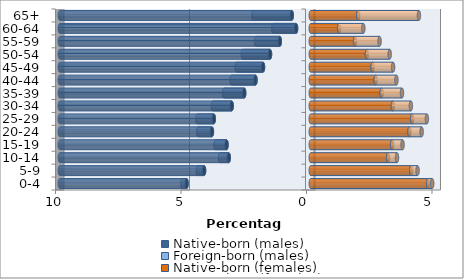
| Category | Native-born (males) | Foreign-born (males) | Native-born (females) | Foreign-born (females) |
|---|---|---|---|---|
| 0-4 | -4.946 | -0.166 | 4.677 | 0.163 |
| 5-9 | -4.249 | -0.251 | 4.004 | 0.253 |
| 10-14 | -3.268 | -0.348 | 3.08 | 0.357 |
| 15-19 | -3.355 | -0.439 | 3.241 | 0.418 |
| 20-24 | -3.937 | -0.547 | 3.933 | 0.486 |
| 25-29 | -3.862 | -0.659 | 4.037 | 0.59 |
| 30-34 | -3.149 | -0.749 | 3.272 | 0.717 |
| 35-39 | -2.651 | -0.8 | 2.826 | 0.808 |
| 40-44 | -2.202 | -0.953 | 2.583 | 0.831 |
| 45-49 | -1.901 | -1.052 | 2.464 | 0.817 |
| 50-54 | -1.622 | -1.082 | 2.238 | 0.908 |
| 55-59 | -1.232 | -0.948 | 1.764 | 0.979 |
| 60-64 | -0.584 | -0.908 | 1.131 | 0.966 |
| 65+ | -0.757 | -1.529 | 1.89 | 2.42 |